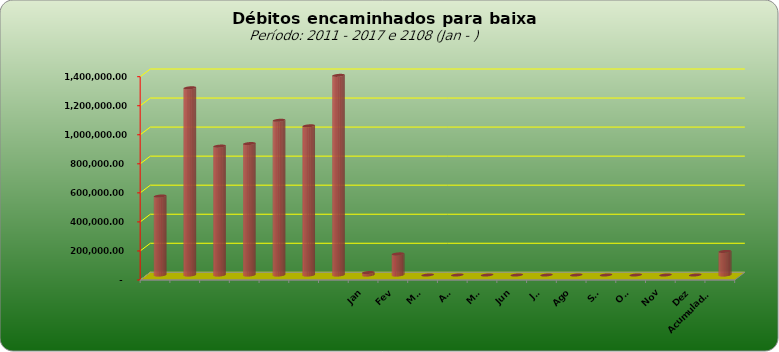
| Category |  543.796,20  |
|---|---|
|  | 543796.2 |
|  | 1289053.69 |
|  | 887573.08 |
|  | 905052.31 |
|  | 1065434.28 |
|  | 1027209.41 |
|  | 1374800.36 |
| Jan | 17005.62 |
| Fev | 145413 |
| Mar | 0 |
| Abr | 0 |
| Mai | 0 |
| Jun | 0 |
| Jul | 0 |
| Ago | 0 |
| Set | 0 |
| Out | 0 |
| Nov | 0 |
| Dez | 0 |
| Acumulado
2016 | 162418.62 |